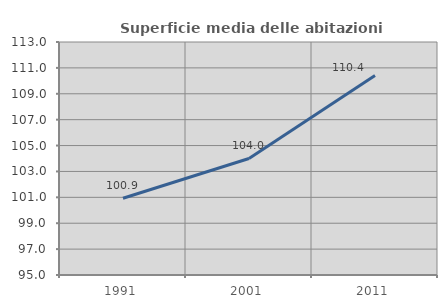
| Category | Superficie media delle abitazioni occupate |
|---|---|
| 1991.0 | 100.93 |
| 2001.0 | 104.004 |
| 2011.0 | 110.412 |